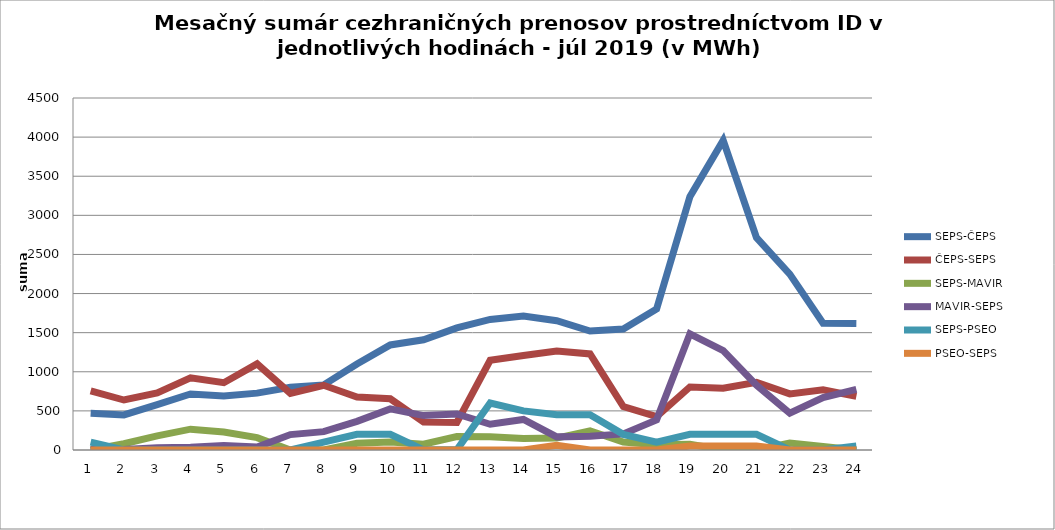
| Category | SEPS-ČEPS | ČEPS-SEPS | SEPS-MAVIR | MAVIR-SEPS | SEPS-PSEO | PSEO-SEPS |
|---|---|---|---|---|---|---|
| 1.0 | 471 | 755 | 0 | 5 | 100 | 0 |
| 2.0 | 448 | 639 | 80 | 7 | 0 | 0 |
| 3.0 | 579 | 730 | 180 | 30 | 0 | 0 |
| 4.0 | 716 | 922 | 266 | 36 | 0 | 0 |
| 5.0 | 692 | 860 | 229 | 57 | 0 | 0 |
| 6.0 | 727 | 1101 | 158 | 37 | 0 | 0 |
| 7.0 | 801 | 724 | 0 | 197 | 0 | 0 |
| 8.0 | 832 | 827 | 0 | 235 | 100 | 0 |
| 9.0 | 1099 | 678 | 86 | 366 | 200 | 0 |
| 10.0 | 1343 | 655 | 101 | 526 | 200 | 0 |
| 11.0 | 1409 | 359 | 74 | 440 | 2 | 0 |
| 12.0 | 1561 | 352 | 173 | 461 | 2 | 0 |
| 13.0 | 1669 | 1147 | 169 | 329 | 600 | 0 |
| 14.0 | 1714 | 1207 | 147 | 391 | 500 | 0 |
| 15.0 | 1653 | 1266 | 152 | 168 | 450 | 60 |
| 16.0 | 1521 | 1228 | 246 | 177 | 450 | 0 |
| 17.0 | 1546 | 555 | 103 | 206 | 200 | 0 |
| 18.0 | 1803 | 426 | 67 | 385 | 100 | 0 |
| 19.0 | 3238 | 806 | 73 | 1485 | 200 | 50 |
| 20.0 | 3958 | 790 | 0 | 1272 | 200 | 50 |
| 21.0 | 2714 | 866 | 0 | 829 | 200 | 50 |
| 22.0 | 2249 | 717 | 88 | 470 | 0 | 0 |
| 23.0 | 1621 | 769 | 46 | 671 | 0 | 0 |
| 24.0 | 1616 | 686 | 0 | 776 | 50 | 0 |